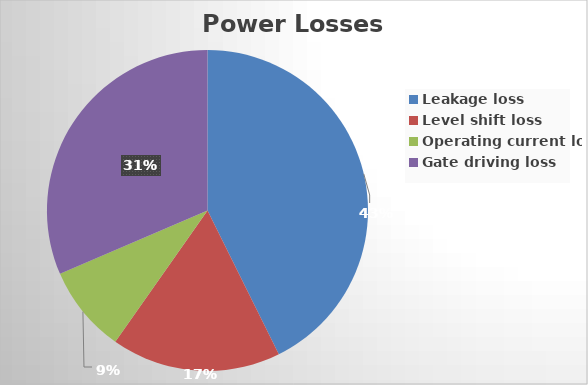
| Category | Series 0 |
|---|---|
| Leakage loss | 81.4 |
| Level shift loss | 32.56 |
| Operating current loss | 16.8 |
| Gate driving loss | 60 |